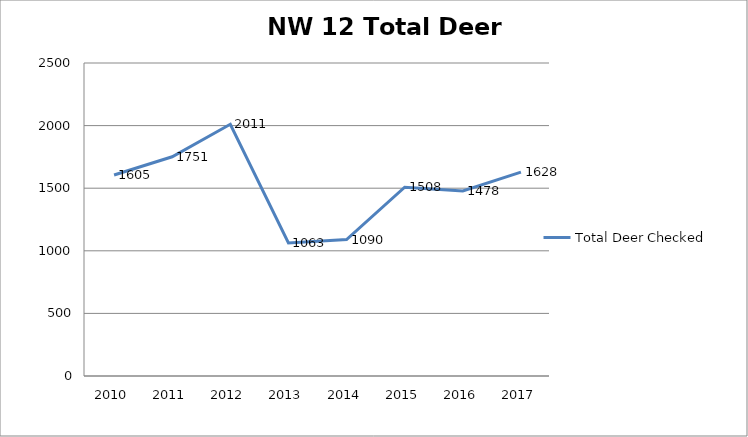
| Category | Total Deer Checked |
|---|---|
| 2010.0 | 1605 |
| 2011.0 | 1751 |
| 2012.0 | 2011 |
| 2013.0 | 1063 |
| 2014.0 | 1090 |
| 2015.0 | 1508 |
| 2016.0 | 1478 |
| 2017.0 | 1628 |